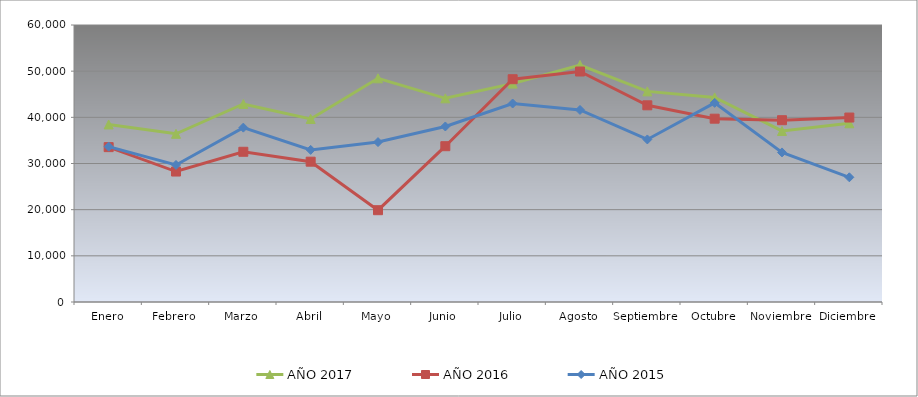
| Category | AÑO 2017 | AÑO 2016 | AÑO 2015 |
|---|---|---|---|
| Enero | 38457.636 | 33545.848 | 33646.111 |
| Febrero | 36434.017 | 28259.512 | 29682.552 |
| Marzo | 42895.397 | 32539.28 | 37767.655 |
| Abril | 39649.914 | 30392.725 | 32946.022 |
| Mayo | 48449.994 | 19886.763 | 34638.937 |
| Junio | 44117.26 | 33748.941 | 38018.572 |
| Julio | 47308.01 | 48258.94 | 42993.544 |
| Agosto | 51333.059 | 49926.67 | 41599.56 |
| Septiembre | 45623.14 | 42601.997 | 35210.47 |
| Octubre | 44321.397 | 39706.816 | 43137.588 |
| Noviembre | 37050.865 | 39380.682 | 32397.721 |
| Diciembre | 38712.067 | 39955.864 | 27009.201 |